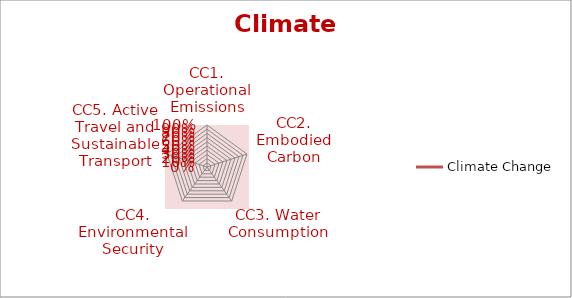
| Category | Climate Change |
|---|---|
| CC1. Operational Emissions | 0 |
| CC2. Embodied Carbon | 0 |
| CC3. Water Consumption | 0 |
| CC4. Environmental Security | 0 |
| CC5. Active Travel and Sustainable Transport | 0 |